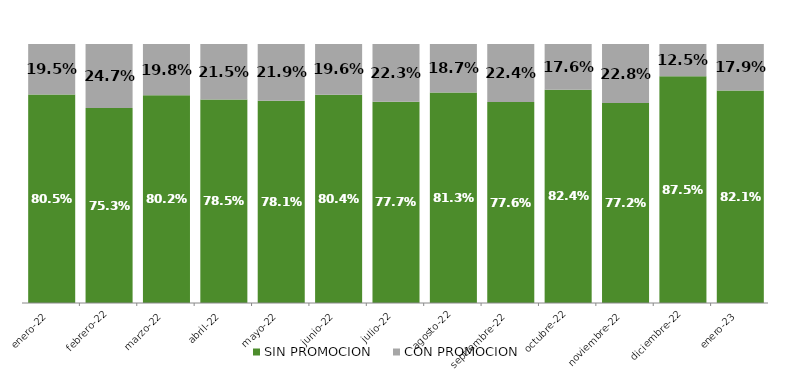
| Category | SIN PROMOCION   | CON PROMOCION   |
|---|---|---|
| 2022-01-01 | 0.805 | 0.195 |
| 2022-02-01 | 0.753 | 0.247 |
| 2022-03-01 | 0.802 | 0.198 |
| 2022-04-01 | 0.785 | 0.215 |
| 2022-05-01 | 0.781 | 0.219 |
| 2022-06-01 | 0.804 | 0.196 |
| 2022-07-01 | 0.777 | 0.223 |
| 2022-08-01 | 0.813 | 0.187 |
| 2022-09-01 | 0.776 | 0.224 |
| 2022-10-01 | 0.824 | 0.176 |
| 2022-11-01 | 0.772 | 0.228 |
| 2022-12-01 | 0.875 | 0.125 |
| 2023-01-01 | 0.821 | 0.179 |